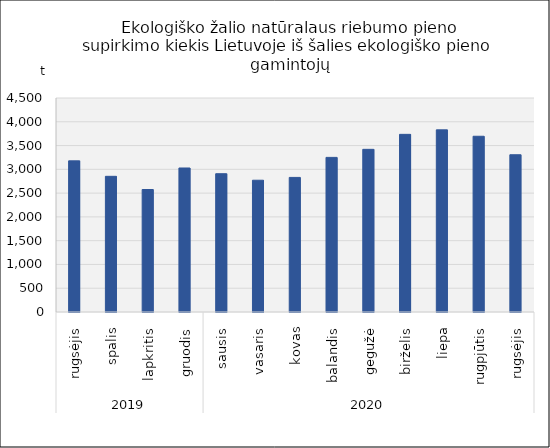
| Category | Ekologiško žalio natūralaus riebumo pieno supirkimo kiekis Lietuvoje iš šalies ekologiško pieno gamintojų |
|---|---|
| 0 | 3178.376 |
| 1 | 2853.018 |
| 2 | 2575.8 |
| 3 | 3028.194 |
| 4 | 2908.043 |
| 5 | 2771.079 |
| 6 | 2829.965 |
| 7 | 3251.285 |
| 8 | 3420.496 |
| 9 | 3735.632 |
| 10 | 3830.15 |
| 11 | 3695.515 |
| 12 | 3306.712 |